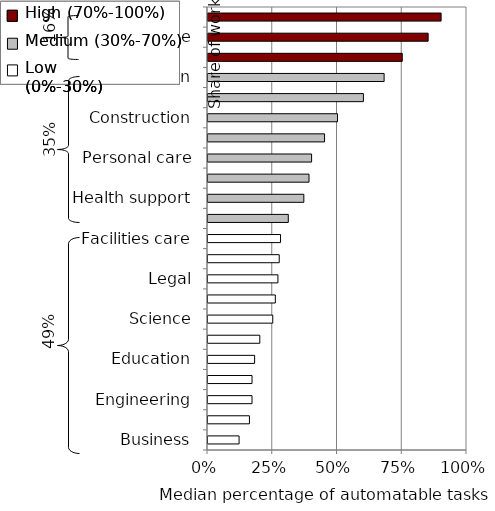
| Category | Series 1 |
|---|---|
| Business | 0.12 |
| Arts/entertainment | 0.16 |
| Engineering | 0.17 |
| Social service | 0.17 |
| Education | 0.18 |
| Management | 0.2 |
| Science | 0.25 |
| Computer | 0.26 |
| Legal | 0.27 |
| Health practition | 0.275 |
| Facilities care | 0.28 |
| Sales | 0.31 |
| Health support | 0.37 |
| Protective | 0.39 |
| Personal care | 0.4 |
| Agriculture | 0.45 |
| Construction | 0.5 |
| Maintenance | 0.6 |
| Administration | 0.68 |
| Transportation | 0.75 |
| Food service | 0.85 |
| Production | 0.9 |